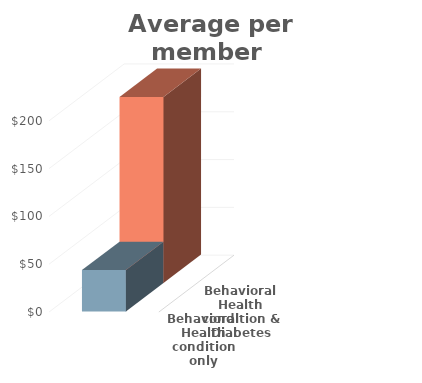
| Category | Behavioral Health condition only | Behavioral Health condition & Diabetes |
|---|---|---|
| 0 | 43.23 | 194.535 |